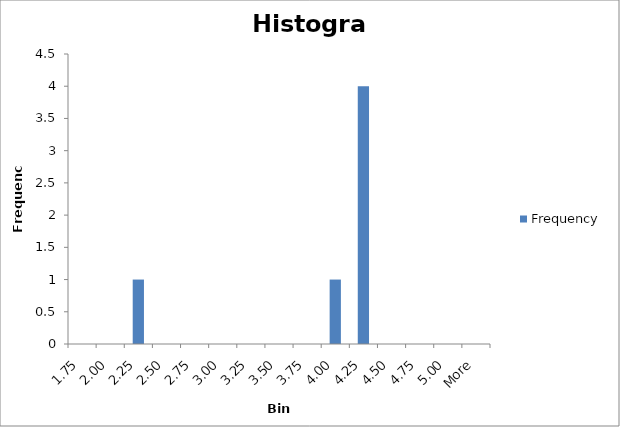
| Category | Frequency |
|---|---|
| 1.75 | 0 |
| 2.00 | 0 |
| 2.25 | 1 |
| 2.50 | 0 |
| 2.75 | 0 |
| 3.00 | 0 |
| 3.25 | 0 |
| 3.50 | 0 |
| 3.75 | 0 |
| 4.00 | 1 |
| 4.25 | 4 |
| 4.50 | 0 |
| 4.75 | 0 |
| 5.00 | 0 |
| More | 0 |